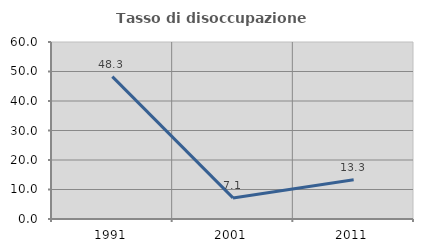
| Category | Tasso di disoccupazione giovanile  |
|---|---|
| 1991.0 | 48.276 |
| 2001.0 | 7.143 |
| 2011.0 | 13.333 |